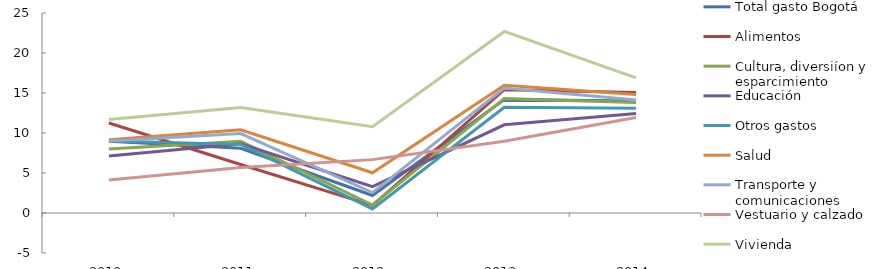
| Category | Total gasto Bogotá | Alimentos | Cultura, diversiíon y esparcimiento | Educación | Otros gastos | Salud | Transporte y comunicaciones | Vestuario y calzado | Vivienda |
|---|---|---|---|---|---|---|---|---|---|
| 2010.0 | 8.965 | 11.252 | 8.004 | 7.121 | 9.014 | 9.156 | 9.012 | 4.122 | 11.677 |
| 2011.0 | 8.094 | 6.068 | 8.96 | 8.657 | 8.578 | 10.402 | 9.932 | 5.674 | 13.186 |
| 2012.0 | 2.185 | 0.954 | 0.999 | 3.287 | 0.505 | 5.026 | 2.547 | 6.672 | 10.798 |
| 2013.0 | 14.172 | 15.416 | 14.295 | 11.027 | 13.216 | 15.96 | 15.61 | 8.966 | 22.697 |
| 2014.0 | 13.99 | 15.048 | 13.81 | 12.438 | 13.088 | 14.808 | 14.12 | 11.949 | 16.888 |